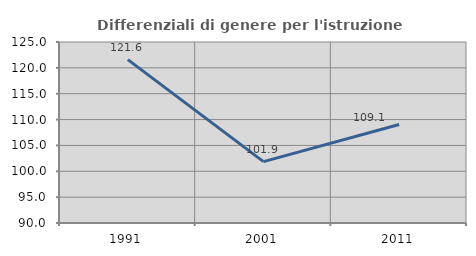
| Category | Differenziali di genere per l'istruzione superiore |
|---|---|
| 1991.0 | 121.595 |
| 2001.0 | 101.871 |
| 2011.0 | 109.05 |